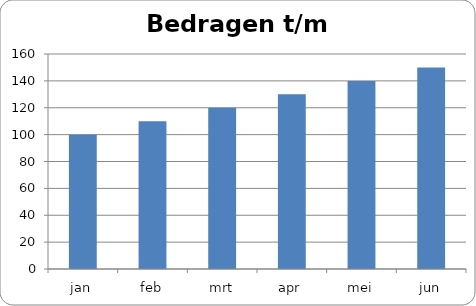
| Category | Bedrag |
|---|---|
| jan | 100 |
| feb | 110 |
| mrt | 120 |
| apr | 130 |
| mei | 140 |
| jun | 150 |